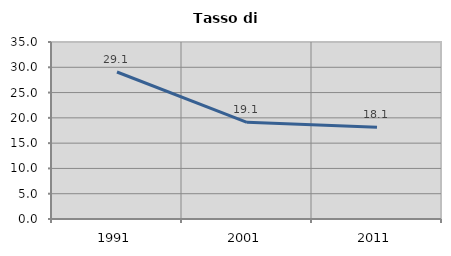
| Category | Tasso di disoccupazione   |
|---|---|
| 1991.0 | 29.071 |
| 2001.0 | 19.121 |
| 2011.0 | 18.141 |